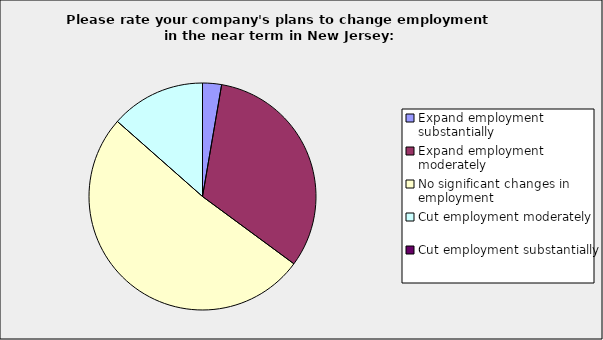
| Category | Series 0 |
|---|---|
| Expand employment substantially | 0.027 |
| Expand employment moderately | 0.324 |
| No significant changes in employment | 0.514 |
| Cut employment moderately | 0.135 |
| Cut employment substantially | 0 |